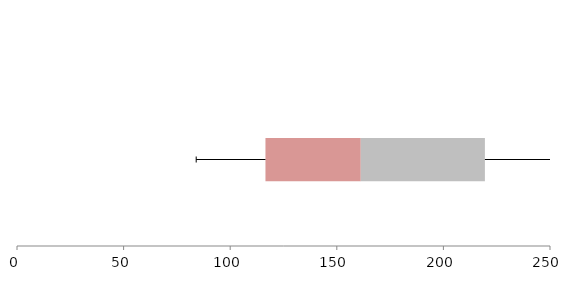
| Category | Series 1 | Series 2 | Series 3 |
|---|---|---|---|
| 0 | 116.541 | 44.706 | 58.22 |